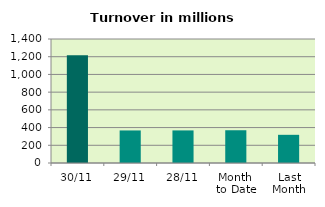
| Category | Series 0 |
|---|---|
| 30/11 | 1215.309 |
| 29/11 | 367.52 |
| 28/11 | 367.916 |
| Month 
to Date | 369.747 |
| Last
Month | 318.176 |